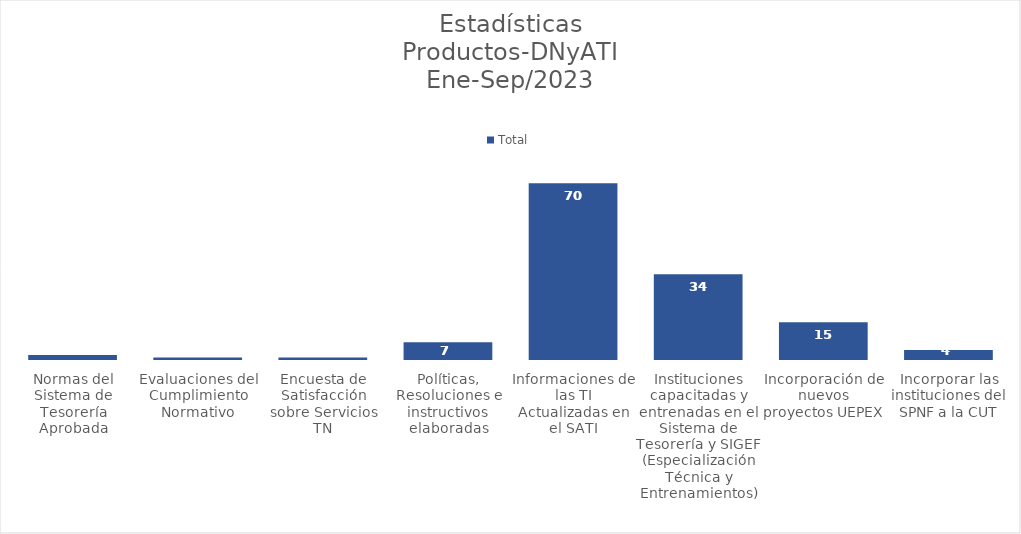
| Category | Total |
|---|---|
| Normas del Sistema de Tesorería Aprobada | 2 |
| Evaluaciones del Cumplimiento Normativo | 1 |
| Encuesta de Satisfacción sobre Servicios TN | 1 |
| Políticas, Resoluciones e instructivos elaboradas | 7 |
| Informaciones de las TI Actualizadas en el SATI | 70 |
| Instituciones capacitadas y entrenadas en el Sistema de Tesorería y SIGEF (Especialización Técnica y Entrenamientos) | 34 |
| Incorporación de nuevos proyectos UEPEX | 15 |
| Incorporar las instituciones del SPNF a la CUT | 4 |